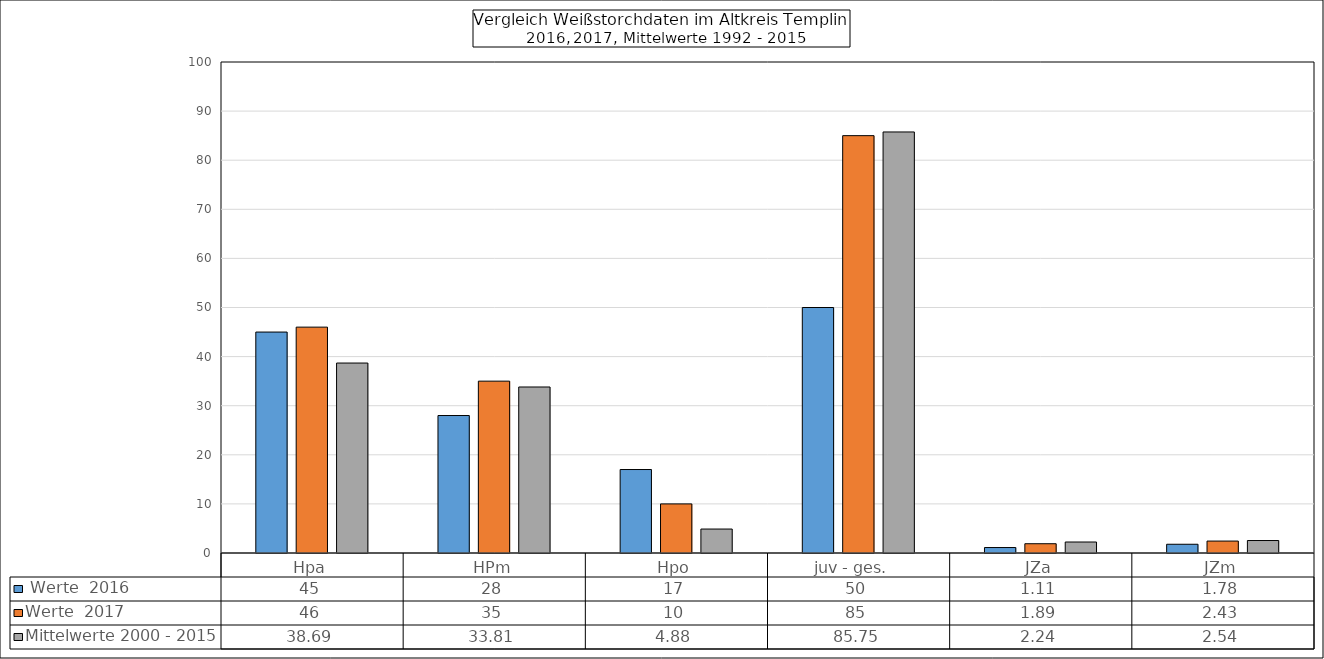
| Category |  Werte  2016 | Werte  2017 | Mittelwerte 2000 - 2015 |
|---|---|---|---|
| Hpa | 45 | 46 | 38.69 |
| HPm | 28 | 35 | 33.81 |
| Hpo | 17 | 10 | 4.88 |
| juv - ges.   | 50 | 85 | 85.75 |
| JZa | 1.111 | 1.89 | 2.24 |
| JZm | 1.78 | 2.43 | 2.54 |